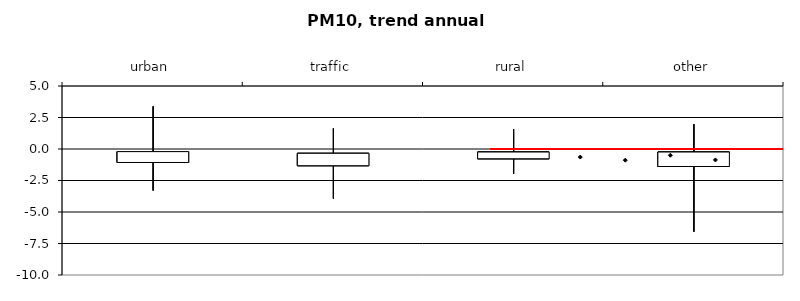
| Category | 25% | min | max | 75% |
|---|---|---|---|---|
| urban | -1.071 | -3.298 | 3.384 | -0.208 |
| traffic | -1.325 | -3.94 | 1.633 | -0.342 |
| rural | -0.776 | -1.965 | 1.572 | -0.24 |
| other | -1.388 | -6.563 | 1.97 | -0.239 |